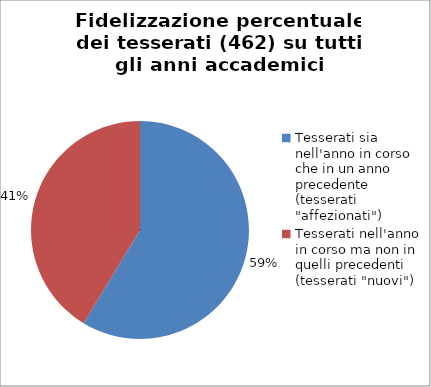
| Category | Nr. Tesserati |
|---|---|
| Tesserati sia nell'anno in corso che in un anno precedente (tesserati "affezionati") | 271 |
| Tesserati nell'anno in corso ma non in quelli precedenti (tesserati "nuovi") | 191 |